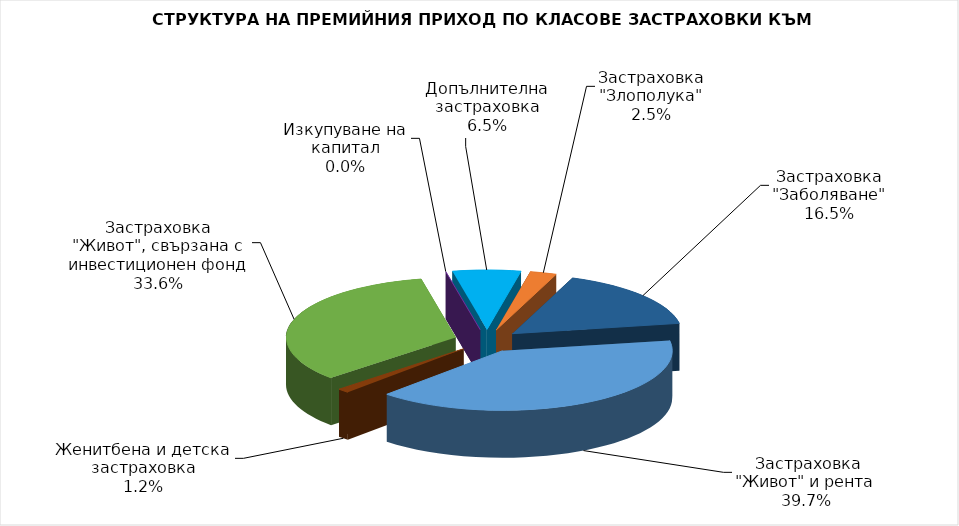
| Category |  Застраховка "Живот" и рента |
|---|---|
|  Застраховка "Живот" и рента | 59533155.965 |
| Женитбена и детска застраховка | 1747355.423 |
| Застраховка "Живот", свързана с инвестиционен фонд | 50361996.366 |
| Изкупуване на капитал | 0 |
| Допълнителна застраховка | 9717410.897 |
| Застраховка "Злополука" | 3797633.611 |
| Застраховка "Заболяване" | 24662657.09 |